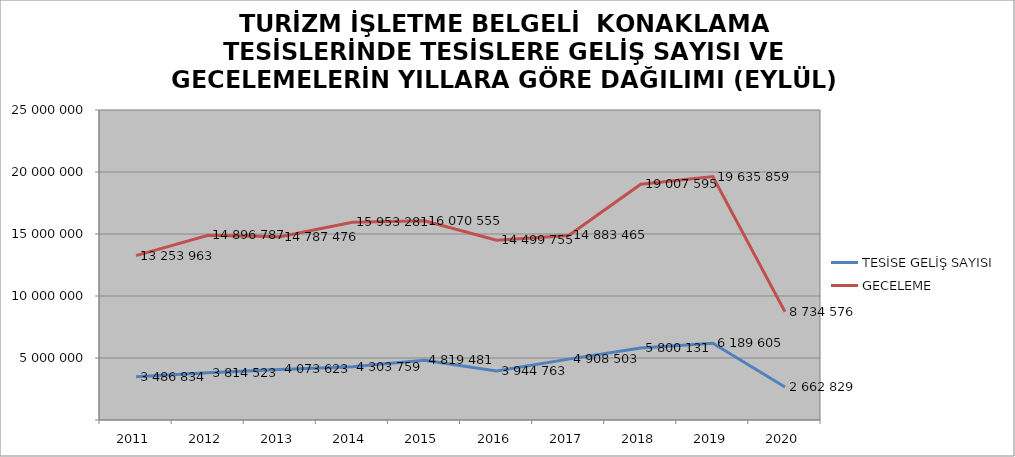
| Category | TESİSE GELİŞ SAYISI | GECELEME |
|---|---|---|
| 2011 | 3486834 | 13253963 |
| 2012 | 3814523 | 14896787 |
| 2013 | 4073623 | 14787476 |
| 2014 | 4303759 | 15953281 |
| 2015 | 4819481 | 16070555 |
| 2016 | 3944763 | 14499755 |
| 2017 | 4908503 | 14883465 |
| 2018 | 5800131 | 19007595 |
| 2019 | 6189605 | 19635859 |
| 2020 | 2662829 | 8734576 |